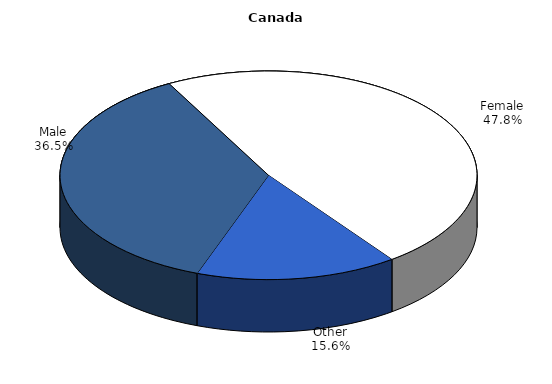
| Category | Canada |
|---|---|
| Male | 0.365 |
| Female | 0.478 |
| Other | 0.156 |